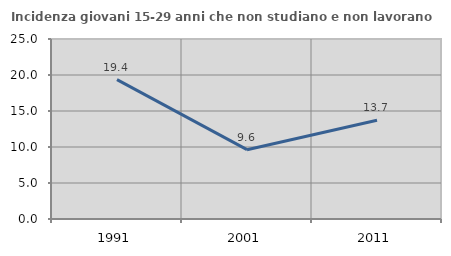
| Category | Incidenza giovani 15-29 anni che non studiano e non lavorano  |
|---|---|
| 1991.0 | 19.355 |
| 2001.0 | 9.626 |
| 2011.0 | 13.707 |